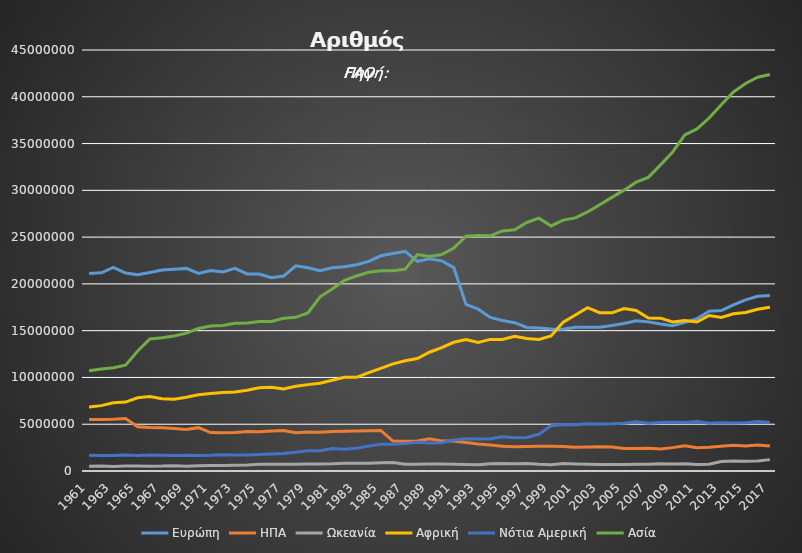
| Category | Ευρώπη | ΗΠΑ | Ωκεανία | Αφρική | Νότια Αμερική | Ασία |
|---|---|---|---|---|---|---|
| 1961.0 | 21097615 | 5514000 | 506660 | 6845050 | 1674168 | 10704894 |
| 1962.0 | 21182265 | 5506000 | 530345 | 6986195 | 1667301 | 10901851 |
| 1963.0 | 21758651 | 5528000 | 491061 | 7291050 | 1663739 | 11040696 |
| 1964.0 | 21159899 | 5601000 | 533889 | 7365275 | 1714513 | 11305317 |
| 1965.0 | 20966688 | 4718000 | 526280 | 7822375 | 1666262 | 12831637 |
| 1966.0 | 21215962 | 4646000 | 511103 | 7950264 | 1698552 | 14118065 |
| 1967.0 | 21473087 | 4635000 | 521193 | 7717458 | 1675458 | 14240893 |
| 1968.0 | 21553536 | 4539000 | 563801 | 7667631 | 1644143 | 14421992 |
| 1969.0 | 21657465 | 4433000 | 502423 | 7874429 | 1673698 | 14737413 |
| 1970.0 | 21111815 | 4634000 | 568802 | 8150830 | 1657233 | 15229994 |
| 1971.0 | 21438088 | 4107000 | 582030 | 8276850 | 1677051 | 15496242 |
| 1972.0 | 21276848 | 4085000 | 600620 | 8391825 | 1742251 | 15548537 |
| 1973.0 | 21668169 | 4124000 | 616047 | 8452865 | 1705988 | 15790608 |
| 1974.0 | 21067973 | 4210000 | 630436 | 8627907 | 1698442 | 15817587 |
| 1975.0 | 21062925 | 4206000 | 709965 | 8894825 | 1764107 | 15968566 |
| 1976.0 | 20660367 | 4269000 | 717077 | 8960050 | 1819819 | 15986723 |
| 1977.0 | 20837161 | 4323000 | 714689 | 8758450 | 1880200 | 16326440 |
| 1978.0 | 21940586 | 4090000 | 708957 | 9066075 | 2006000 | 16423198 |
| 1979.0 | 21731227 | 4163000 | 744613 | 9232100 | 2156200 | 16886254 |
| 1980.0 | 21420093 | 4141000 | 761222 | 9373150 | 2157505 | 18614607 |
| 1981.0 | 21726143 | 4213000 | 768807 | 9707975 | 2411000 | 19465522 |
| 1982.0 | 21834699 | 4250000 | 816996 | 10009600 | 2327355 | 20369194 |
| 1983.0 | 22054026 | 4275000 | 816643 | 10009500 | 2432293 | 20847873 |
| 1984.0 | 22405275 | 4300000 | 821617 | 10507125 | 2668377 | 21240135 |
| 1985.0 | 23005170 | 4325000 | 877692 | 10972200 | 2848477 | 21411964 |
| 1986.0 | 23242102 | 3205000 | 903547 | 11454325 | 2869000 | 21392778 |
| 1987.0 | 23471899 | 3190000 | 719696 | 11786125 | 2947000 | 21575806 |
| 1988.0 | 22398798 | 3219000 | 717024 | 12022625 | 3076500 | 23132048 |
| 1989.0 | 22694857 | 3443000 | 751148 | 12694622 | 2982600 | 22929232 |
| 1990.0 | 22466656 | 3210000 | 741379 | 13185854 | 3015200 | 23130582 |
| 1991.0 | 21740465 | 3211000 | 714945 | 13759094 | 3325100 | 23821268 |
| 1992.0 | 17804191 | 3045000 | 689246 | 14051600 | 3435600 | 25089994 |
| 1993.0 | 17301276 | 2875000 | 679266 | 13739700 | 3420100 | 25184585 |
| 1994.0 | 16418600 | 2783000 | 774772 | 14069000 | 3451700 | 25135172 |
| 1995.0 | 16090198 | 2655000 | 801786 | 14062337 | 3665700 | 25663970 |
| 1996.0 | 15851960 | 2581000 | 772568 | 14395882 | 3546100 | 25779529 |
| 1997.0 | 15340291 | 2631000 | 793185 | 14158420 | 3586100 | 26563613 |
| 1998.0 | 15278716 | 2637000 | 715637 | 14057474 | 3928100 | 27030317 |
| 1999.0 | 15165580 | 2652000 | 680292 | 14429620 | 4828100 | 26193849 |
| 2000.0 | 15144609 | 2622000 | 796939 | 15915322 | 4936100 | 26818529 |
| 2001.0 | 15364135 | 2550000 | 742207 | 16667411 | 4943600 | 27051227 |
| 2002.0 | 15356163 | 2574000 | 715258 | 17453211 | 5061600 | 27688189 |
| 2003.0 | 15359545 | 2599000 | 706800 | 16917261 | 5025600 | 28464727 |
| 2004.0 | 15547345 | 2554000 | 699359 | 16909639 | 5046600 | 29245255 |
| 2005.0 | 15765899 | 2409000 | 701881 | 17358849 | 5097100 | 30019437 |
| 2006.0 | 16053566 | 2394000 | 709101 | 17150721 | 5269600 | 30874995 |
| 2007.0 | 15940670 | 2443000 | 731769 | 16363017 | 5093271 | 31386690 |
| 2008.0 | 15711366 | 2342000 | 767269 | 16339675 | 5180062 | 32723600 |
| 2009.0 | 15532658 | 2498000 | 759678 | 15927464 | 5212397 | 34103511 |
| 2010.0 | 15881398 | 2692000 | 764941 | 16083587 | 5187447 | 35933821 |
| 2011.0 | 16272212 | 2491000 | 690847 | 15922478 | 5281800 | 36564559 |
| 2012.0 | 17065826 | 2539000 | 714277 | 16616932 | 5095750 | 37729639 |
| 2013.0 | 17151268 | 2640000 | 1006024 | 16421472 | 5164250 | 39150980 |
| 2014.0 | 17758810 | 2740000 | 1060651 | 16801350 | 5140223 | 40515487 |
| 2015.0 | 18295324 | 2660000 | 1050401 | 16940506 | 5157504 | 41425956 |
| 2016.0 | 18668671 | 2775000 | 1076920 | 17290628 | 5296425 | 42093232 |
| 2017.0 | 18764349 | 2669000 | 1216267 | 17507222 | 5182058 | 42372690 |